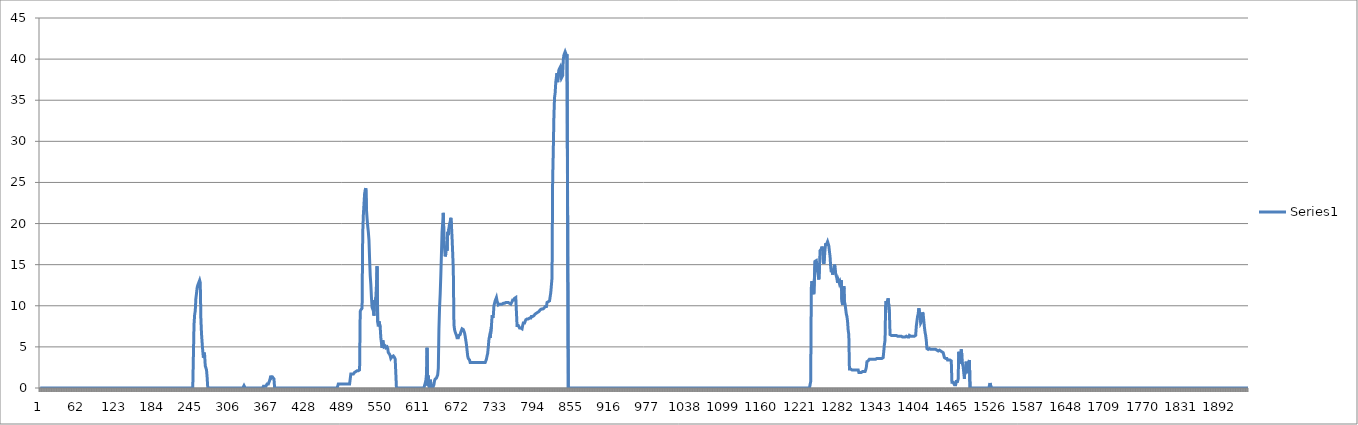
| Category | Series 0 |
|---|---|
| 0 | 0 |
| 1 | 0 |
| 2 | 0 |
| 3 | 0 |
| 4 | 0 |
| 5 | 0 |
| 6 | 0 |
| 7 | 0 |
| 8 | 0 |
| 9 | 0 |
| 10 | 0 |
| 11 | 0 |
| 12 | 0 |
| 13 | 0 |
| 14 | 0 |
| 15 | 0 |
| 16 | 0 |
| 17 | 0 |
| 18 | 0 |
| 19 | 0 |
| 20 | 0 |
| 21 | 0 |
| 22 | 0 |
| 23 | 0 |
| 24 | 0 |
| 25 | 0 |
| 26 | 0 |
| 27 | 0 |
| 28 | 0 |
| 29 | 0 |
| 30 | 0 |
| 31 | 0 |
| 32 | 0 |
| 33 | 0 |
| 34 | 0 |
| 35 | 0 |
| 36 | 0 |
| 37 | 0 |
| 38 | 0 |
| 39 | 0 |
| 40 | 0 |
| 41 | 0 |
| 42 | 0 |
| 43 | 0 |
| 44 | 0 |
| 45 | 0 |
| 46 | 0 |
| 47 | 0 |
| 48 | 0 |
| 49 | 0 |
| 50 | 0 |
| 51 | 0 |
| 52 | 0 |
| 53 | 0 |
| 54 | 0 |
| 55 | 0 |
| 56 | 0 |
| 57 | 0 |
| 58 | 0 |
| 59 | 0 |
| 60 | 0 |
| 61 | 0 |
| 62 | 0 |
| 63 | 0 |
| 64 | 0 |
| 65 | 0 |
| 66 | 0 |
| 67 | 0 |
| 68 | 0 |
| 69 | 0 |
| 70 | 0 |
| 71 | 0 |
| 72 | 0 |
| 73 | 0 |
| 74 | 0 |
| 75 | 0 |
| 76 | 0 |
| 77 | 0 |
| 78 | 0 |
| 79 | 0 |
| 80 | 0 |
| 81 | 0 |
| 82 | 0 |
| 83 | 0 |
| 84 | 0 |
| 85 | 0 |
| 86 | 0 |
| 87 | 0 |
| 88 | 0 |
| 89 | 0 |
| 90 | 0 |
| 91 | 0 |
| 92 | 0 |
| 93 | 0 |
| 94 | 0 |
| 95 | 0 |
| 96 | 0 |
| 97 | 0 |
| 98 | 0 |
| 99 | 0 |
| 100 | 0 |
| 101 | 0 |
| 102 | 0 |
| 103 | 0 |
| 104 | 0 |
| 105 | 0 |
| 106 | 0 |
| 107 | 0 |
| 108 | 0 |
| 109 | 0 |
| 110 | 0 |
| 111 | 0 |
| 112 | 0 |
| 113 | 0 |
| 114 | 0 |
| 115 | 0 |
| 116 | 0 |
| 117 | 0 |
| 118 | 0 |
| 119 | 0 |
| 120 | 0 |
| 121 | 0 |
| 122 | 0 |
| 123 | 0 |
| 124 | 0 |
| 125 | 0 |
| 126 | 0 |
| 127 | 0 |
| 128 | 0 |
| 129 | 0 |
| 130 | 0 |
| 131 | 0 |
| 132 | 0 |
| 133 | 0 |
| 134 | 0 |
| 135 | 0 |
| 136 | 0 |
| 137 | 0 |
| 138 | 0 |
| 139 | 0 |
| 140 | 0 |
| 141 | 0 |
| 142 | 0 |
| 143 | 0 |
| 144 | 0 |
| 145 | 0 |
| 146 | 0 |
| 147 | 0 |
| 148 | 0 |
| 149 | 0 |
| 150 | 0 |
| 151 | 0 |
| 152 | 0 |
| 153 | 0 |
| 154 | 0 |
| 155 | 0 |
| 156 | 0 |
| 157 | 0 |
| 158 | 0 |
| 159 | 0 |
| 160 | 0 |
| 161 | 0 |
| 162 | 0 |
| 163 | 0 |
| 164 | 0 |
| 165 | 0 |
| 166 | 0 |
| 167 | 0 |
| 168 | 0 |
| 169 | 0 |
| 170 | 0 |
| 171 | 0 |
| 172 | 0 |
| 173 | 0 |
| 174 | 0 |
| 175 | 0 |
| 176 | 0 |
| 177 | 0 |
| 178 | 0 |
| 179 | 0 |
| 180 | 0 |
| 181 | 0 |
| 182 | 0 |
| 183 | 0 |
| 184 | 0 |
| 185 | 0 |
| 186 | 0 |
| 187 | 0 |
| 188 | 0 |
| 189 | 0 |
| 190 | 0 |
| 191 | 0 |
| 192 | 0 |
| 193 | 0 |
| 194 | 0 |
| 195 | 0 |
| 196 | 0 |
| 197 | 0 |
| 198 | 0 |
| 199 | 0 |
| 200 | 0 |
| 201 | 0 |
| 202 | 0 |
| 203 | 0 |
| 204 | 0 |
| 205 | 0 |
| 206 | 0 |
| 207 | 0 |
| 208 | 0 |
| 209 | 0 |
| 210 | 0 |
| 211 | 0 |
| 212 | 0 |
| 213 | 0 |
| 214 | 0 |
| 215 | 0 |
| 216 | 0 |
| 217 | 0 |
| 218 | 0 |
| 219 | 0 |
| 220 | 0 |
| 221 | 0 |
| 222 | 0 |
| 223 | 0 |
| 224 | 0 |
| 225 | 0 |
| 226 | 0 |
| 227 | 0 |
| 228 | 0 |
| 229 | 0 |
| 230 | 0 |
| 231 | 0 |
| 232 | 0 |
| 233 | 0 |
| 234 | 0 |
| 235 | 0 |
| 236 | 0 |
| 237 | 0 |
| 238 | 0 |
| 239 | 0 |
| 240 | 0 |
| 241 | 0 |
| 242 | 0 |
| 243 | 0 |
| 244 | 0 |
| 245 | 0 |
| 246 | 7.7 |
| 247 | 8.9 |
| 248 | 9.4 |
| 249 | 10.9 |
| 250 | 11.5 |
| 251 | 12.2 |
| 252 | 12.5 |
| 253 | 12.5 |
| 254 | 12.9 |
| 255 | 13.1 |
| 256 | 12.8 |
| 257 | 8.4 |
| 258 | 6.6 |
| 259 | 5.5 |
| 260 | 4.5 |
| 261 | 3.7 |
| 262 | 4.3 |
| 263 | 4 |
| 264 | 2.7 |
| 265 | 2.6 |
| 266 | 2.2 |
| 267 | 1.3 |
| 268 | 0 |
| 269 | 0 |
| 270 | 0 |
| 271 | 0 |
| 272 | 0 |
| 273 | 0 |
| 274 | 0 |
| 275 | 0 |
| 276 | 0 |
| 277 | 0 |
| 278 | 0 |
| 279 | 0 |
| 280 | 0 |
| 281 | 0 |
| 282 | 0 |
| 283 | 0 |
| 284 | 0 |
| 285 | 0 |
| 286 | 0 |
| 287 | 0 |
| 288 | 0 |
| 289 | 0 |
| 290 | 0 |
| 291 | 0 |
| 292 | 0 |
| 293 | 0 |
| 294 | 0 |
| 295 | 0 |
| 296 | 0 |
| 297 | 0 |
| 298 | 0 |
| 299 | 0 |
| 300 | 0 |
| 301 | 0 |
| 302 | 0 |
| 303 | 0 |
| 304 | 0 |
| 305 | 0 |
| 306 | 0 |
| 307 | 0 |
| 308 | 0 |
| 309 | 0 |
| 310 | 0 |
| 311 | 0 |
| 312 | 0 |
| 313 | 0 |
| 314 | 0 |
| 315 | 0 |
| 316 | 0 |
| 317 | 0 |
| 318 | 0 |
| 319 | 0 |
| 320 | 0 |
| 321 | 0 |
| 322 | 0 |
| 323 | 0 |
| 324 | 0 |
| 325 | 0 |
| 326 | 0.3 |
| 327 | 0.3 |
| 328 | 0 |
| 329 | 0 |
| 330 | 0 |
| 331 | 0 |
| 332 | 0 |
| 333 | 0 |
| 334 | 0 |
| 335 | 0 |
| 336 | 0 |
| 337 | 0 |
| 338 | 0 |
| 339 | 0 |
| 340 | 0 |
| 341 | 0 |
| 342 | 0 |
| 343 | 0 |
| 344 | 0 |
| 345 | 0 |
| 346 | 0 |
| 347 | 0 |
| 348 | 0 |
| 349 | 0 |
| 350 | 0 |
| 351 | 0 |
| 352 | 0 |
| 353 | 0 |
| 354 | 0 |
| 355 | 0 |
| 356 | 0 |
| 357 | 0.2 |
| 358 | 0.2 |
| 359 | 0.2 |
| 360 | 0.2 |
| 361 | 0.2 |
| 362 | 0.3 |
| 363 | 0.5 |
| 364 | 0.5 |
| 365 | 0.5 |
| 366 | 0.5 |
| 367 | 0.9 |
| 368 | 1.2 |
| 369 | 1.5 |
| 370 | 1.2 |
| 371 | 1.2 |
| 372 | 1.3 |
| 373 | 1.4 |
| 374 | 1.1 |
| 375 | 0 |
| 376 | 0 |
| 377 | 0 |
| 378 | 0 |
| 379 | 0 |
| 380 | 0 |
| 381 | 0 |
| 382 | 0 |
| 383 | 0 |
| 384 | 0 |
| 385 | 0 |
| 386 | 0 |
| 387 | 0 |
| 388 | 0 |
| 389 | 0 |
| 390 | 0 |
| 391 | 0 |
| 392 | 0 |
| 393 | 0 |
| 394 | 0 |
| 395 | 0 |
| 396 | 0 |
| 397 | 0 |
| 398 | 0 |
| 399 | 0 |
| 400 | 0 |
| 401 | 0 |
| 402 | 0 |
| 403 | 0 |
| 404 | 0 |
| 405 | 0 |
| 406 | 0 |
| 407 | 0 |
| 408 | 0 |
| 409 | 0 |
| 410 | 0 |
| 411 | 0 |
| 412 | 0 |
| 413 | 0 |
| 414 | 0 |
| 415 | 0 |
| 416 | 0 |
| 417 | 0 |
| 418 | 0 |
| 419 | 0 |
| 420 | 0 |
| 421 | 0 |
| 422 | 0 |
| 423 | 0 |
| 424 | 0 |
| 425 | 0 |
| 426 | 0 |
| 427 | 0 |
| 428 | 0 |
| 429 | 0 |
| 430 | 0 |
| 431 | 0 |
| 432 | 0 |
| 433 | 0 |
| 434 | 0 |
| 435 | 0 |
| 436 | 0 |
| 437 | 0 |
| 438 | 0 |
| 439 | 0 |
| 440 | 0 |
| 441 | 0 |
| 442 | 0 |
| 443 | 0 |
| 444 | 0 |
| 445 | 0 |
| 446 | 0 |
| 447 | 0 |
| 448 | 0 |
| 449 | 0 |
| 450 | 0 |
| 451 | 0 |
| 452 | 0 |
| 453 | 0 |
| 454 | 0 |
| 455 | 0 |
| 456 | 0 |
| 457 | 0 |
| 458 | 0 |
| 459 | 0 |
| 460 | 0 |
| 461 | 0 |
| 462 | 0 |
| 463 | 0 |
| 464 | 0 |
| 465 | 0 |
| 466 | 0 |
| 467 | 0 |
| 468 | 0 |
| 469 | 0 |
| 470 | 0 |
| 471 | 0 |
| 472 | 0 |
| 473 | 0 |
| 474 | 0 |
| 475 | 0 |
| 476 | 0 |
| 477 | 0.5 |
| 478 | 0.5 |
| 479 | 0.5 |
| 480 | 0.5 |
| 481 | 0.5 |
| 482 | 0.5 |
| 483 | 0.5 |
| 484 | 0.5 |
| 485 | 0.5 |
| 486 | 0.5 |
| 487 | 0.5 |
| 488 | 0.5 |
| 489 | 0.5 |
| 490 | 0.5 |
| 491 | 0.5 |
| 492 | 0.5 |
| 493 | 0.5 |
| 494 | 0.5 |
| 495 | 0.5 |
| 496 | 0.5 |
| 497 | 1.7 |
| 498 | 1.7 |
| 499 | 1.7 |
| 500 | 1.7 |
| 501 | 1.7 |
| 502 | 1.7 |
| 503 | 1.9 |
| 504 | 2 |
| 505 | 2 |
| 506 | 2 |
| 507 | 2.1 |
| 508 | 2.1 |
| 509 | 2.1 |
| 510 | 2.2 |
| 511 | 2.2 |
| 512 | 9.3 |
| 513 | 9.5 |
| 514 | 9.6 |
| 515 | 9.7 |
| 516 | 18.8 |
| 517 | 21 |
| 518 | 22.3 |
| 519 | 23.6 |
| 520 | 24.1 |
| 521 | 24.3 |
| 522 | 21.7 |
| 523 | 20.6 |
| 524 | 19.7 |
| 525 | 19 |
| 526 | 18 |
| 527 | 15.7 |
| 528 | 13.7 |
| 529 | 12.6 |
| 530 | 11 |
| 531 | 9.8 |
| 532 | 9.7 |
| 533 | 9.4 |
| 534 | 8.8 |
| 535 | 10.7 |
| 536 | 10.5 |
| 537 | 11 |
| 538 | 12.5 |
| 539 | 14.8 |
| 540 | 8 |
| 541 | 7.5 |
| 542 | 8.1 |
| 543 | 8 |
| 544 | 7.4 |
| 545 | 6.1 |
| 546 | 6 |
| 547 | 4.9 |
| 548 | 5.8 |
| 549 | 5.7 |
| 550 | 5 |
| 551 | 5 |
| 552 | 5.1 |
| 553 | 4.9 |
| 554 | 5 |
| 555 | 5 |
| 556 | 4.8 |
| 557 | 4.3 |
| 558 | 4.2 |
| 559 | 4.1 |
| 560 | 3.9 |
| 561 | 3.6 |
| 562 | 3.7 |
| 563 | 3.8 |
| 564 | 3.9 |
| 565 | 3.9 |
| 566 | 3.9 |
| 567 | 3.7 |
| 568 | 3.5 |
| 569 | 3.4 |
| 570 | 0 |
| 571 | 0 |
| 572 | 0 |
| 573 | 0 |
| 574 | 0 |
| 575 | 0 |
| 576 | 0 |
| 577 | 0 |
| 578 | 0 |
| 579 | 0 |
| 580 | 0 |
| 581 | 0 |
| 582 | 0 |
| 583 | 0 |
| 584 | 0 |
| 585 | 0 |
| 586 | 0 |
| 587 | 0 |
| 588 | 0 |
| 589 | 0 |
| 590 | 0 |
| 591 | 0 |
| 592 | 0 |
| 593 | 0 |
| 594 | 0 |
| 595 | 0 |
| 596 | 0 |
| 597 | 0 |
| 598 | 0 |
| 599 | 0 |
| 600 | 0 |
| 601 | 0 |
| 602 | 0 |
| 603 | 0 |
| 604 | 0 |
| 605 | 0 |
| 606 | 0 |
| 607 | 0 |
| 608 | 0 |
| 609 | 0 |
| 610 | 0 |
| 611 | 0 |
| 612 | 0 |
| 613 | 0 |
| 614 | 0 |
| 615 | 0.3 |
| 616 | 0.4 |
| 617 | 0.9 |
| 618 | 1.6 |
| 619 | 4.9 |
| 620 | 0.3 |
| 621 | 1.5 |
| 622 | 0.2 |
| 623 | 0 |
| 624 | 1 |
| 625 | 0.6 |
| 626 | 0 |
| 627 | 0 |
| 628 | 0 |
| 629 | 0 |
| 630 | 0.4 |
| 631 | 0.9 |
| 632 | 1.1 |
| 633 | 1.1 |
| 634 | 1.2 |
| 635 | 1.3 |
| 636 | 1.6 |
| 637 | 2.4 |
| 638 | 7.2 |
| 639 | 9.8 |
| 640 | 11.4 |
| 641 | 13.7 |
| 642 | 16.3 |
| 643 | 19 |
| 644 | 20.1 |
| 645 | 21.3 |
| 646 | 18.1 |
| 647 | 17 |
| 648 | 16 |
| 649 | 16.3 |
| 650 | 17.3 |
| 651 | 16.7 |
| 652 | 19 |
| 653 | 18.6 |
| 654 | 19.4 |
| 655 | 20 |
| 656 | 20.2 |
| 657 | 20.7 |
| 658 | 19.8 |
| 659 | 18.3 |
| 660 | 16.4 |
| 661 | 14.4 |
| 662 | 7.7 |
| 663 | 7.1 |
| 664 | 6.8 |
| 665 | 6.6 |
| 666 | 6.4 |
| 667 | 6.1 |
| 668 | 6.1 |
| 669 | 6.1 |
| 670 | 6.4 |
| 671 | 6.3 |
| 672 | 6.5 |
| 673 | 6.8 |
| 674 | 7 |
| 675 | 7.2 |
| 676 | 7.2 |
| 677 | 7.1 |
| 678 | 6.9 |
| 679 | 6.7 |
| 680 | 6.3 |
| 681 | 5.8 |
| 682 | 5.3 |
| 683 | 4.6 |
| 684 | 3.9 |
| 685 | 3.6 |
| 686 | 3.5 |
| 687 | 3.4 |
| 688 | 3.1 |
| 689 | 3.1 |
| 690 | 3.1 |
| 691 | 3.1 |
| 692 | 3.1 |
| 693 | 3.1 |
| 694 | 3.1 |
| 695 | 3.1 |
| 696 | 3.1 |
| 697 | 3.1 |
| 698 | 3.1 |
| 699 | 3.1 |
| 700 | 3.1 |
| 701 | 3.1 |
| 702 | 3.1 |
| 703 | 3.1 |
| 704 | 3.1 |
| 705 | 3.1 |
| 706 | 3.1 |
| 707 | 3.1 |
| 708 | 3.1 |
| 709 | 3.1 |
| 710 | 3.1 |
| 711 | 3.1 |
| 712 | 3.1 |
| 713 | 3.2 |
| 714 | 3.5 |
| 715 | 3.9 |
| 716 | 4.2 |
| 717 | 5 |
| 718 | 5.9 |
| 719 | 6.3 |
| 720 | 6.1 |
| 721 | 6.2 |
| 722 | 7.5 |
| 723 | 8.7 |
| 724 | 8.7 |
| 725 | 8.7 |
| 726 | 10 |
| 727 | 10.1 |
| 728 | 10.6 |
| 729 | 10.5 |
| 730 | 11 |
| 731 | 10.6 |
| 732 | 10.5 |
| 733 | 10.1 |
| 734 | 10.1 |
| 735 | 10.2 |
| 736 | 10.2 |
| 737 | 10.2 |
| 738 | 10.2 |
| 739 | 10.2 |
| 740 | 10.3 |
| 741 | 10.3 |
| 742 | 10.3 |
| 743 | 10.3 |
| 744 | 10.3 |
| 745 | 10.4 |
| 746 | 10.4 |
| 747 | 10.4 |
| 748 | 10.5 |
| 749 | 10.4 |
| 750 | 10.4 |
| 751 | 10.3 |
| 752 | 10.4 |
| 753 | 10.2 |
| 754 | 10.3 |
| 755 | 10.5 |
| 756 | 10.7 |
| 757 | 10.7 |
| 758 | 10.7 |
| 759 | 10.9 |
| 760 | 10.9 |
| 761 | 11 |
| 762 | 11.1 |
| 763 | 7.6 |
| 764 | 7.7 |
| 765 | 7.6 |
| 766 | 7.6 |
| 767 | 7.3 |
| 768 | 7.4 |
| 769 | 7.3 |
| 770 | 7.3 |
| 771 | 7.2 |
| 772 | 7.6 |
| 773 | 7.9 |
| 774 | 7.9 |
| 775 | 7.9 |
| 776 | 8 |
| 777 | 8.3 |
| 778 | 8.3 |
| 779 | 8.4 |
| 780 | 8.4 |
| 781 | 8.4 |
| 782 | 8.5 |
| 783 | 8.5 |
| 784 | 8.6 |
| 785 | 8.5 |
| 786 | 8.7 |
| 787 | 8.7 |
| 788 | 8.7 |
| 789 | 8.8 |
| 790 | 8.8 |
| 791 | 8.9 |
| 792 | 9 |
| 793 | 9 |
| 794 | 9.1 |
| 795 | 9.1 |
| 796 | 9.2 |
| 797 | 9.2 |
| 798 | 9.3 |
| 799 | 9.4 |
| 800 | 9.5 |
| 801 | 9.5 |
| 802 | 9.6 |
| 803 | 9.6 |
| 804 | 9.6 |
| 805 | 9.7 |
| 806 | 9.7 |
| 807 | 9.8 |
| 808 | 9.9 |
| 809 | 9.9 |
| 810 | 9.9 |
| 811 | 10.4 |
| 812 | 10.5 |
| 813 | 10.5 |
| 814 | 10.5 |
| 815 | 10.6 |
| 816 | 10.7 |
| 817 | 11.6 |
| 818 | 12.5 |
| 819 | 13.4 |
| 820 | 25.3 |
| 821 | 28.8 |
| 822 | 33 |
| 823 | 35.3 |
| 824 | 35.9 |
| 825 | 37.2 |
| 826 | 37.8 |
| 827 | 38.3 |
| 828 | 37.2 |
| 829 | 38.1 |
| 830 | 38.7 |
| 831 | 38.7 |
| 832 | 39 |
| 833 | 38.3 |
| 834 | 37.7 |
| 835 | 37.8 |
| 836 | 38 |
| 837 | 39.9 |
| 838 | 40.5 |
| 839 | 40.4 |
| 840 | 40.9 |
| 841 | 40.7 |
| 842 | 40.4 |
| 843 | 40.6 |
| 844 | 40.5 |
| 845 | 0 |
| 846 | 0 |
| 847 | 0 |
| 848 | 0 |
| 849 | 0 |
| 850 | 0 |
| 851 | 0 |
| 852 | 0 |
| 853 | 0 |
| 854 | 0 |
| 855 | 0 |
| 856 | 0 |
| 857 | 0 |
| 858 | 0 |
| 859 | 0 |
| 860 | 0 |
| 861 | 0 |
| 862 | 0 |
| 863 | 0 |
| 864 | 0 |
| 865 | 0 |
| 866 | 0 |
| 867 | 0 |
| 868 | 0 |
| 869 | 0 |
| 870 | 0 |
| 871 | 0 |
| 872 | 0 |
| 873 | 0 |
| 874 | 0 |
| 875 | 0 |
| 876 | 0 |
| 877 | 0 |
| 878 | 0 |
| 879 | 0 |
| 880 | 0 |
| 881 | 0 |
| 882 | 0 |
| 883 | 0 |
| 884 | 0 |
| 885 | 0 |
| 886 | 0 |
| 887 | 0 |
| 888 | 0 |
| 889 | 0 |
| 890 | 0 |
| 891 | 0 |
| 892 | 0 |
| 893 | 0 |
| 894 | 0 |
| 895 | 0 |
| 896 | 0 |
| 897 | 0 |
| 898 | 0 |
| 899 | 0 |
| 900 | 0 |
| 901 | 0 |
| 902 | 0 |
| 903 | 0 |
| 904 | 0 |
| 905 | 0 |
| 906 | 0 |
| 907 | 0 |
| 908 | 0 |
| 909 | 0 |
| 910 | 0 |
| 911 | 0 |
| 912 | 0 |
| 913 | 0 |
| 914 | 0 |
| 915 | 0 |
| 916 | 0 |
| 917 | 0 |
| 918 | 0 |
| 919 | 0 |
| 920 | 0 |
| 921 | 0 |
| 922 | 0 |
| 923 | 0 |
| 924 | 0 |
| 925 | 0 |
| 926 | 0 |
| 927 | 0 |
| 928 | 0 |
| 929 | 0 |
| 930 | 0 |
| 931 | 0 |
| 932 | 0 |
| 933 | 0 |
| 934 | 0 |
| 935 | 0 |
| 936 | 0 |
| 937 | 0 |
| 938 | 0 |
| 939 | 0 |
| 940 | 0 |
| 941 | 0 |
| 942 | 0 |
| 943 | 0 |
| 944 | 0 |
| 945 | 0 |
| 946 | 0 |
| 947 | 0 |
| 948 | 0 |
| 949 | 0 |
| 950 | 0 |
| 951 | 0 |
| 952 | 0 |
| 953 | 0 |
| 954 | 0 |
| 955 | 0 |
| 956 | 0 |
| 957 | 0 |
| 958 | 0 |
| 959 | 0 |
| 960 | 0 |
| 961 | 0 |
| 962 | 0 |
| 963 | 0 |
| 964 | 0 |
| 965 | 0 |
| 966 | 0 |
| 967 | 0 |
| 968 | 0 |
| 969 | 0 |
| 970 | 0 |
| 971 | 0 |
| 972 | 0 |
| 973 | 0 |
| 974 | 0 |
| 975 | 0 |
| 976 | 0 |
| 977 | 0 |
| 978 | 0 |
| 979 | 0 |
| 980 | 0 |
| 981 | 0 |
| 982 | 0 |
| 983 | 0 |
| 984 | 0 |
| 985 | 0 |
| 986 | 0 |
| 987 | 0 |
| 988 | 0 |
| 989 | 0 |
| 990 | 0 |
| 991 | 0 |
| 992 | 0 |
| 993 | 0 |
| 994 | 0 |
| 995 | 0 |
| 996 | 0 |
| 997 | 0 |
| 998 | 0 |
| 999 | 0 |
| 1000 | 0 |
| 1001 | 0 |
| 1002 | 0 |
| 1003 | 0 |
| 1004 | 0 |
| 1005 | 0 |
| 1006 | 0 |
| 1007 | 0 |
| 1008 | 0 |
| 1009 | 0 |
| 1010 | 0 |
| 1011 | 0 |
| 1012 | 0 |
| 1013 | 0 |
| 1014 | 0 |
| 1015 | 0 |
| 1016 | 0 |
| 1017 | 0 |
| 1018 | 0 |
| 1019 | 0 |
| 1020 | 0 |
| 1021 | 0 |
| 1022 | 0 |
| 1023 | 0 |
| 1024 | 0 |
| 1025 | 0 |
| 1026 | 0 |
| 1027 | 0 |
| 1028 | 0 |
| 1029 | 0 |
| 1030 | 0 |
| 1031 | 0 |
| 1032 | 0 |
| 1033 | 0 |
| 1034 | 0 |
| 1035 | 0 |
| 1036 | 0 |
| 1037 | 0 |
| 1038 | 0 |
| 1039 | 0 |
| 1040 | 0 |
| 1041 | 0 |
| 1042 | 0 |
| 1043 | 0 |
| 1044 | 0 |
| 1045 | 0 |
| 1046 | 0 |
| 1047 | 0 |
| 1048 | 0 |
| 1049 | 0 |
| 1050 | 0 |
| 1051 | 0 |
| 1052 | 0 |
| 1053 | 0 |
| 1054 | 0 |
| 1055 | 0 |
| 1056 | 0 |
| 1057 | 0 |
| 1058 | 0 |
| 1059 | 0 |
| 1060 | 0 |
| 1061 | 0 |
| 1062 | 0 |
| 1063 | 0 |
| 1064 | 0 |
| 1065 | 0 |
| 1066 | 0 |
| 1067 | 0 |
| 1068 | 0 |
| 1069 | 0 |
| 1070 | 0 |
| 1071 | 0 |
| 1072 | 0 |
| 1073 | 0 |
| 1074 | 0 |
| 1075 | 0 |
| 1076 | 0 |
| 1077 | 0 |
| 1078 | 0 |
| 1079 | 0 |
| 1080 | 0 |
| 1081 | 0 |
| 1082 | 0 |
| 1083 | 0 |
| 1084 | 0 |
| 1085 | 0 |
| 1086 | 0 |
| 1087 | 0 |
| 1088 | 0 |
| 1089 | 0 |
| 1090 | 0 |
| 1091 | 0 |
| 1092 | 0 |
| 1093 | 0 |
| 1094 | 0 |
| 1095 | 0 |
| 1096 | 0 |
| 1097 | 0 |
| 1098 | 0 |
| 1099 | 0 |
| 1100 | 0 |
| 1101 | 0 |
| 1102 | 0 |
| 1103 | 0 |
| 1104 | 0 |
| 1105 | 0 |
| 1106 | 0 |
| 1107 | 0 |
| 1108 | 0 |
| 1109 | 0 |
| 1110 | 0 |
| 1111 | 0 |
| 1112 | 0 |
| 1113 | 0 |
| 1114 | 0 |
| 1115 | 0 |
| 1116 | 0 |
| 1117 | 0 |
| 1118 | 0 |
| 1119 | 0 |
| 1120 | 0 |
| 1121 | 0 |
| 1122 | 0 |
| 1123 | 0 |
| 1124 | 0 |
| 1125 | 0 |
| 1126 | 0 |
| 1127 | 0 |
| 1128 | 0 |
| 1129 | 0 |
| 1130 | 0 |
| 1131 | 0 |
| 1132 | 0 |
| 1133 | 0 |
| 1134 | 0 |
| 1135 | 0 |
| 1136 | 0 |
| 1137 | 0 |
| 1138 | 0 |
| 1139 | 0 |
| 1140 | 0 |
| 1141 | 0 |
| 1142 | 0 |
| 1143 | 0 |
| 1144 | 0 |
| 1145 | 0 |
| 1146 | 0 |
| 1147 | 0 |
| 1148 | 0 |
| 1149 | 0 |
| 1150 | 0 |
| 1151 | 0 |
| 1152 | 0 |
| 1153 | 0 |
| 1154 | 0 |
| 1155 | 0 |
| 1156 | 0 |
| 1157 | 0 |
| 1158 | 0 |
| 1159 | 0 |
| 1160 | 0 |
| 1161 | 0 |
| 1162 | 0 |
| 1163 | 0 |
| 1164 | 0 |
| 1165 | 0 |
| 1166 | 0 |
| 1167 | 0 |
| 1168 | 0 |
| 1169 | 0 |
| 1170 | 0 |
| 1171 | 0 |
| 1172 | 0 |
| 1173 | 0 |
| 1174 | 0 |
| 1175 | 0 |
| 1176 | 0 |
| 1177 | 0 |
| 1178 | 0 |
| 1179 | 0 |
| 1180 | 0 |
| 1181 | 0 |
| 1182 | 0 |
| 1183 | 0 |
| 1184 | 0 |
| 1185 | 0 |
| 1186 | 0 |
| 1187 | 0 |
| 1188 | 0 |
| 1189 | 0 |
| 1190 | 0 |
| 1191 | 0 |
| 1192 | 0 |
| 1193 | 0 |
| 1194 | 0 |
| 1195 | 0 |
| 1196 | 0 |
| 1197 | 0 |
| 1198 | 0 |
| 1199 | 0 |
| 1200 | 0 |
| 1201 | 0 |
| 1202 | 0 |
| 1203 | 0 |
| 1204 | 0 |
| 1205 | 0 |
| 1206 | 0 |
| 1207 | 0 |
| 1208 | 0 |
| 1209 | 0 |
| 1210 | 0 |
| 1211 | 0 |
| 1212 | 0 |
| 1213 | 0 |
| 1214 | 0 |
| 1215 | 0 |
| 1216 | 0 |
| 1217 | 0 |
| 1218 | 0 |
| 1219 | 0 |
| 1220 | 0 |
| 1221 | 0 |
| 1222 | 0 |
| 1223 | 0 |
| 1224 | 0 |
| 1225 | 0 |
| 1226 | 0 |
| 1227 | 0 |
| 1228 | 0 |
| 1229 | 0 |
| 1230 | 0 |
| 1231 | 0 |
| 1232 | 0 |
| 1233 | 0.8 |
| 1234 | 12.2 |
| 1235 | 13 |
| 1236 | 13 |
| 1237 | 11.6 |
| 1238 | 11.4 |
| 1239 | 11.4 |
| 1240 | 15.4 |
| 1241 | 15.4 |
| 1242 | 15.5 |
| 1243 | 14.9 |
| 1244 | 14.5 |
| 1245 | 13.7 |
| 1246 | 13.2 |
| 1247 | 14.6 |
| 1248 | 16.7 |
| 1249 | 16.6 |
| 1250 | 16.9 |
| 1251 | 17.2 |
| 1252 | 16.9 |
| 1253 | 15.5 |
| 1254 | 15.1 |
| 1255 | 15.9 |
| 1256 | 16.9 |
| 1257 | 17.6 |
| 1258 | 17.3 |
| 1259 | 17.6 |
| 1260 | 17.8 |
| 1261 | 17.8 |
| 1262 | 17.3 |
| 1263 | 16.6 |
| 1264 | 16 |
| 1265 | 14.7 |
| 1266 | 14.1 |
| 1267 | 14.5 |
| 1268 | 13.8 |
| 1269 | 14 |
| 1270 | 14.6 |
| 1271 | 15 |
| 1272 | 14.7 |
| 1273 | 13.9 |
| 1274 | 13.8 |
| 1275 | 13.3 |
| 1276 | 12.8 |
| 1277 | 13.2 |
| 1278 | 13 |
| 1279 | 12.7 |
| 1280 | 12.9 |
| 1281 | 12.6 |
| 1282 | 13.1 |
| 1283 | 10.5 |
| 1284 | 10.1 |
| 1285 | 10 |
| 1286 | 12.4 |
| 1287 | 10.5 |
| 1288 | 10.2 |
| 1289 | 9.6 |
| 1290 | 9 |
| 1291 | 8.7 |
| 1292 | 8.1 |
| 1293 | 7 |
| 1294 | 6.5 |
| 1295 | 2.3 |
| 1296 | 2.3 |
| 1297 | 2.3 |
| 1298 | 2.3 |
| 1299 | 2.2 |
| 1300 | 2.2 |
| 1301 | 2.2 |
| 1302 | 2.2 |
| 1303 | 2.2 |
| 1304 | 2.2 |
| 1305 | 2.2 |
| 1306 | 2.2 |
| 1307 | 2.2 |
| 1308 | 2.2 |
| 1309 | 2.2 |
| 1310 | 1.9 |
| 1311 | 1.9 |
| 1312 | 1.9 |
| 1313 | 1.9 |
| 1314 | 1.9 |
| 1315 | 1.9 |
| 1316 | 2 |
| 1317 | 2 |
| 1318 | 2 |
| 1319 | 2 |
| 1320 | 2 |
| 1321 | 2.2 |
| 1322 | 2.5 |
| 1323 | 3.2 |
| 1324 | 3.3 |
| 1325 | 3.3 |
| 1326 | 3.3 |
| 1327 | 3.5 |
| 1328 | 3.5 |
| 1329 | 3.5 |
| 1330 | 3.5 |
| 1331 | 3.5 |
| 1332 | 3.5 |
| 1333 | 3.5 |
| 1334 | 3.5 |
| 1335 | 3.5 |
| 1336 | 3.5 |
| 1337 | 3.5 |
| 1338 | 3.5 |
| 1339 | 3.6 |
| 1340 | 3.6 |
| 1341 | 3.6 |
| 1342 | 3.6 |
| 1343 | 3.6 |
| 1344 | 3.6 |
| 1345 | 3.6 |
| 1346 | 3.6 |
| 1347 | 3.6 |
| 1348 | 3.7 |
| 1349 | 3.7 |
| 1350 | 3.7 |
| 1351 | 5.3 |
| 1352 | 5.8 |
| 1353 | 10.4 |
| 1354 | 10.5 |
| 1355 | 10.4 |
| 1356 | 10.5 |
| 1357 | 10.9 |
| 1358 | 10.8 |
| 1359 | 9.1 |
| 1360 | 6.5 |
| 1361 | 6.5 |
| 1362 | 6.4 |
| 1363 | 6.4 |
| 1364 | 6.4 |
| 1365 | 6.4 |
| 1366 | 6.4 |
| 1367 | 6.4 |
| 1368 | 6.4 |
| 1369 | 6.4 |
| 1370 | 6.4 |
| 1371 | 6.3 |
| 1372 | 6.3 |
| 1373 | 6.3 |
| 1374 | 6.3 |
| 1375 | 6.3 |
| 1376 | 6.3 |
| 1377 | 6.3 |
| 1378 | 6.3 |
| 1379 | 6.2 |
| 1380 | 6.2 |
| 1381 | 6.2 |
| 1382 | 6.2 |
| 1383 | 6.2 |
| 1384 | 6.2 |
| 1385 | 6.3 |
| 1386 | 6.3 |
| 1387 | 6.2 |
| 1388 | 6.2 |
| 1389 | 6.2 |
| 1390 | 6.2 |
| 1391 | 6.4 |
| 1392 | 6.3 |
| 1393 | 6.3 |
| 1394 | 6.2 |
| 1395 | 6.3 |
| 1396 | 6.3 |
| 1397 | 6.3 |
| 1398 | 6.3 |
| 1399 | 6.3 |
| 1400 | 6.4 |
| 1401 | 6.4 |
| 1402 | 7.5 |
| 1403 | 8.1 |
| 1404 | 8.7 |
| 1405 | 9 |
| 1406 | 9.7 |
| 1407 | 9.3 |
| 1408 | 8.7 |
| 1409 | 7.9 |
| 1410 | 7.9 |
| 1411 | 8.2 |
| 1412 | 9.2 |
| 1413 | 9 |
| 1414 | 8.2 |
| 1415 | 7.4 |
| 1416 | 6.8 |
| 1417 | 6.4 |
| 1418 | 5.8 |
| 1419 | 4.8 |
| 1420 | 4.7 |
| 1421 | 4.7 |
| 1422 | 4.7 |
| 1423 | 4.8 |
| 1424 | 4.7 |
| 1425 | 4.7 |
| 1426 | 4.7 |
| 1427 | 4.7 |
| 1428 | 4.7 |
| 1429 | 4.7 |
| 1430 | 4.7 |
| 1431 | 4.7 |
| 1432 | 4.7 |
| 1433 | 4.7 |
| 1434 | 4.7 |
| 1435 | 4.6 |
| 1436 | 4.6 |
| 1437 | 4.5 |
| 1438 | 4.5 |
| 1439 | 4.6 |
| 1440 | 4.6 |
| 1441 | 4.5 |
| 1442 | 4.4 |
| 1443 | 4.4 |
| 1444 | 4.5 |
| 1445 | 4.3 |
| 1446 | 4 |
| 1447 | 3.7 |
| 1448 | 3.6 |
| 1449 | 3.6 |
| 1450 | 3.6 |
| 1451 | 3.6 |
| 1452 | 3.4 |
| 1453 | 3.4 |
| 1454 | 3.4 |
| 1455 | 3.4 |
| 1456 | 3.4 |
| 1457 | 3.3 |
| 1458 | 3.3 |
| 1459 | 0.7 |
| 1460 | 0.7 |
| 1461 | 0.7 |
| 1462 | 0.7 |
| 1463 | 0.4 |
| 1464 | 0.4 |
| 1465 | 0.4 |
| 1466 | 0.8 |
| 1467 | 0.8 |
| 1468 | 0.8 |
| 1469 | 1.1 |
| 1470 | 4.4 |
| 1471 | 3 |
| 1472 | 3.2 |
| 1473 | 3.2 |
| 1474 | 4.7 |
| 1475 | 3.9 |
| 1476 | 2.9 |
| 1477 | 2.6 |
| 1478 | 2.6 |
| 1479 | 1.1 |
| 1480 | 2.5 |
| 1481 | 1.9 |
| 1482 | 3.2 |
| 1483 | 2 |
| 1484 | 1.8 |
| 1485 | 3 |
| 1486 | 3 |
| 1487 | 3.4 |
| 1488 | 0 |
| 1489 | 0 |
| 1490 | 0 |
| 1491 | 0 |
| 1492 | 0 |
| 1493 | 0 |
| 1494 | 0 |
| 1495 | 0 |
| 1496 | 0 |
| 1497 | 0 |
| 1498 | 0 |
| 1499 | 0 |
| 1500 | 0 |
| 1501 | 0 |
| 1502 | 0 |
| 1503 | 0 |
| 1504 | 0 |
| 1505 | 0 |
| 1506 | 0 |
| 1507 | 0 |
| 1508 | 0 |
| 1509 | 0 |
| 1510 | 0 |
| 1511 | 0 |
| 1512 | 0 |
| 1513 | 0 |
| 1514 | 0 |
| 1515 | 0 |
| 1516 | 0 |
| 1517 | 0 |
| 1518 | 0 |
| 1519 | 0 |
| 1520 | 0.6 |
| 1521 | 0.6 |
| 1522 | 0 |
| 1523 | 0 |
| 1524 | 0 |
| 1525 | 0 |
| 1526 | 0 |
| 1527 | 0 |
| 1528 | 0 |
| 1529 | 0 |
| 1530 | 0 |
| 1531 | 0 |
| 1532 | 0 |
| 1533 | 0 |
| 1534 | 0 |
| 1535 | 0 |
| 1536 | 0 |
| 1537 | 0 |
| 1538 | 0 |
| 1539 | 0 |
| 1540 | 0 |
| 1541 | 0 |
| 1542 | 0 |
| 1543 | 0 |
| 1544 | 0 |
| 1545 | 0 |
| 1546 | 0 |
| 1547 | 0 |
| 1548 | 0 |
| 1549 | 0 |
| 1550 | 0 |
| 1551 | 0 |
| 1552 | 0 |
| 1553 | 0 |
| 1554 | 0 |
| 1555 | 0 |
| 1556 | 0 |
| 1557 | 0 |
| 1558 | 0 |
| 1559 | 0 |
| 1560 | 0 |
| 1561 | 0 |
| 1562 | 0 |
| 1563 | 0 |
| 1564 | 0 |
| 1565 | 0 |
| 1566 | 0 |
| 1567 | 0 |
| 1568 | 0 |
| 1569 | 0 |
| 1570 | 0 |
| 1571 | 0 |
| 1572 | 0 |
| 1573 | 0 |
| 1574 | 0 |
| 1575 | 0 |
| 1576 | 0 |
| 1577 | 0 |
| 1578 | 0 |
| 1579 | 0 |
| 1580 | 0 |
| 1581 | 0 |
| 1582 | 0 |
| 1583 | 0 |
| 1584 | 0 |
| 1585 | 0 |
| 1586 | 0 |
| 1587 | 0 |
| 1588 | 0 |
| 1589 | 0 |
| 1590 | 0 |
| 1591 | 0 |
| 1592 | 0 |
| 1593 | 0 |
| 1594 | 0 |
| 1595 | 0 |
| 1596 | 0 |
| 1597 | 0 |
| 1598 | 0 |
| 1599 | 0 |
| 1600 | 0 |
| 1601 | 0 |
| 1602 | 0 |
| 1603 | 0 |
| 1604 | 0 |
| 1605 | 0 |
| 1606 | 0 |
| 1607 | 0 |
| 1608 | 0 |
| 1609 | 0 |
| 1610 | 0 |
| 1611 | 0 |
| 1612 | 0 |
| 1613 | 0 |
| 1614 | 0 |
| 1615 | 0 |
| 1616 | 0 |
| 1617 | 0 |
| 1618 | 0 |
| 1619 | 0 |
| 1620 | 0 |
| 1621 | 0 |
| 1622 | 0 |
| 1623 | 0 |
| 1624 | 0 |
| 1625 | 0 |
| 1626 | 0 |
| 1627 | 0 |
| 1628 | 0 |
| 1629 | 0 |
| 1630 | 0 |
| 1631 | 0 |
| 1632 | 0 |
| 1633 | 0 |
| 1634 | 0 |
| 1635 | 0 |
| 1636 | 0 |
| 1637 | 0 |
| 1638 | 0 |
| 1639 | 0 |
| 1640 | 0 |
| 1641 | 0 |
| 1642 | 0 |
| 1643 | 0 |
| 1644 | 0 |
| 1645 | 0 |
| 1646 | 0 |
| 1647 | 0 |
| 1648 | 0 |
| 1649 | 0 |
| 1650 | 0 |
| 1651 | 0 |
| 1652 | 0 |
| 1653 | 0 |
| 1654 | 0 |
| 1655 | 0 |
| 1656 | 0 |
| 1657 | 0 |
| 1658 | 0 |
| 1659 | 0 |
| 1660 | 0 |
| 1661 | 0 |
| 1662 | 0 |
| 1663 | 0 |
| 1664 | 0 |
| 1665 | 0 |
| 1666 | 0 |
| 1667 | 0 |
| 1668 | 0 |
| 1669 | 0 |
| 1670 | 0 |
| 1671 | 0 |
| 1672 | 0 |
| 1673 | 0 |
| 1674 | 0 |
| 1675 | 0 |
| 1676 | 0 |
| 1677 | 0 |
| 1678 | 0 |
| 1679 | 0 |
| 1680 | 0 |
| 1681 | 0 |
| 1682 | 0 |
| 1683 | 0 |
| 1684 | 0 |
| 1685 | 0 |
| 1686 | 0 |
| 1687 | 0 |
| 1688 | 0 |
| 1689 | 0 |
| 1690 | 0 |
| 1691 | 0 |
| 1692 | 0 |
| 1693 | 0 |
| 1694 | 0 |
| 1695 | 0 |
| 1696 | 0 |
| 1697 | 0 |
| 1698 | 0 |
| 1699 | 0 |
| 1700 | 0 |
| 1701 | 0 |
| 1702 | 0 |
| 1703 | 0 |
| 1704 | 0 |
| 1705 | 0 |
| 1706 | 0 |
| 1707 | 0 |
| 1708 | 0 |
| 1709 | 0 |
| 1710 | 0 |
| 1711 | 0 |
| 1712 | 0 |
| 1713 | 0 |
| 1714 | 0 |
| 1715 | 0 |
| 1716 | 0 |
| 1717 | 0 |
| 1718 | 0 |
| 1719 | 0 |
| 1720 | 0 |
| 1721 | 0 |
| 1722 | 0 |
| 1723 | 0 |
| 1724 | 0 |
| 1725 | 0 |
| 1726 | 0 |
| 1727 | 0 |
| 1728 | 0 |
| 1729 | 0 |
| 1730 | 0 |
| 1731 | 0 |
| 1732 | 0 |
| 1733 | 0 |
| 1734 | 0 |
| 1735 | 0 |
| 1736 | 0 |
| 1737 | 0 |
| 1738 | 0 |
| 1739 | 0 |
| 1740 | 0 |
| 1741 | 0 |
| 1742 | 0 |
| 1743 | 0 |
| 1744 | 0 |
| 1745 | 0 |
| 1746 | 0 |
| 1747 | 0 |
| 1748 | 0 |
| 1749 | 0 |
| 1750 | 0 |
| 1751 | 0 |
| 1752 | 0 |
| 1753 | 0 |
| 1754 | 0 |
| 1755 | 0 |
| 1756 | 0 |
| 1757 | 0 |
| 1758 | 0 |
| 1759 | 0 |
| 1760 | 0 |
| 1761 | 0 |
| 1762 | 0 |
| 1763 | 0 |
| 1764 | 0 |
| 1765 | 0 |
| 1766 | 0 |
| 1767 | 0 |
| 1768 | 0 |
| 1769 | 0 |
| 1770 | 0 |
| 1771 | 0 |
| 1772 | 0 |
| 1773 | 0 |
| 1774 | 0 |
| 1775 | 0 |
| 1776 | 0 |
| 1777 | 0 |
| 1778 | 0 |
| 1779 | 0 |
| 1780 | 0 |
| 1781 | 0 |
| 1782 | 0 |
| 1783 | 0 |
| 1784 | 0 |
| 1785 | 0 |
| 1786 | 0 |
| 1787 | 0 |
| 1788 | 0 |
| 1789 | 0 |
| 1790 | 0 |
| 1791 | 0 |
| 1792 | 0 |
| 1793 | 0 |
| 1794 | 0 |
| 1795 | 0 |
| 1796 | 0 |
| 1797 | 0 |
| 1798 | 0 |
| 1799 | 0 |
| 1800 | 0 |
| 1801 | 0 |
| 1802 | 0 |
| 1803 | 0 |
| 1804 | 0 |
| 1805 | 0 |
| 1806 | 0 |
| 1807 | 0 |
| 1808 | 0 |
| 1809 | 0 |
| 1810 | 0 |
| 1811 | 0 |
| 1812 | 0 |
| 1813 | 0 |
| 1814 | 0 |
| 1815 | 0 |
| 1816 | 0 |
| 1817 | 0 |
| 1818 | 0 |
| 1819 | 0 |
| 1820 | 0 |
| 1821 | 0 |
| 1822 | 0 |
| 1823 | 0 |
| 1824 | 0 |
| 1825 | 0 |
| 1826 | 0 |
| 1827 | 0 |
| 1828 | 0 |
| 1829 | 0 |
| 1830 | 0 |
| 1831 | 0 |
| 1832 | 0 |
| 1833 | 0 |
| 1834 | 0 |
| 1835 | 0 |
| 1836 | 0 |
| 1837 | 0 |
| 1838 | 0 |
| 1839 | 0 |
| 1840 | 0 |
| 1841 | 0 |
| 1842 | 0 |
| 1843 | 0 |
| 1844 | 0 |
| 1845 | 0 |
| 1846 | 0 |
| 1847 | 0 |
| 1848 | 0 |
| 1849 | 0 |
| 1850 | 0 |
| 1851 | 0 |
| 1852 | 0 |
| 1853 | 0 |
| 1854 | 0 |
| 1855 | 0 |
| 1856 | 0 |
| 1857 | 0 |
| 1858 | 0 |
| 1859 | 0 |
| 1860 | 0 |
| 1861 | 0 |
| 1862 | 0 |
| 1863 | 0 |
| 1864 | 0 |
| 1865 | 0 |
| 1866 | 0 |
| 1867 | 0 |
| 1868 | 0 |
| 1869 | 0 |
| 1870 | 0 |
| 1871 | 0 |
| 1872 | 0 |
| 1873 | 0 |
| 1874 | 0 |
| 1875 | 0 |
| 1876 | 0 |
| 1877 | 0 |
| 1878 | 0 |
| 1879 | 0 |
| 1880 | 0 |
| 1881 | 0 |
| 1882 | 0 |
| 1883 | 0 |
| 1884 | 0 |
| 1885 | 0 |
| 1886 | 0 |
| 1887 | 0 |
| 1888 | 0 |
| 1889 | 0 |
| 1890 | 0 |
| 1891 | 0 |
| 1892 | 0 |
| 1893 | 0 |
| 1894 | 0 |
| 1895 | 0 |
| 1896 | 0 |
| 1897 | 0 |
| 1898 | 0 |
| 1899 | 0 |
| 1900 | 0 |
| 1901 | 0 |
| 1902 | 0 |
| 1903 | 0 |
| 1904 | 0 |
| 1905 | 0 |
| 1906 | 0 |
| 1907 | 0 |
| 1908 | 0 |
| 1909 | 0 |
| 1910 | 0 |
| 1911 | 0 |
| 1912 | 0 |
| 1913 | 0 |
| 1914 | 0 |
| 1915 | 0 |
| 1916 | 0 |
| 1917 | 0 |
| 1918 | 0 |
| 1919 | 0 |
| 1920 | 0 |
| 1921 | 0 |
| 1922 | 0 |
| 1923 | 0 |
| 1924 | 0 |
| 1925 | 0 |
| 1926 | 0 |
| 1927 | 0 |
| 1928 | 0 |
| 1929 | 0 |
| 1930 | 0 |
| 1931 | 0 |
| 1932 | 0 |
| 1933 | 0 |
| 1934 | 0 |